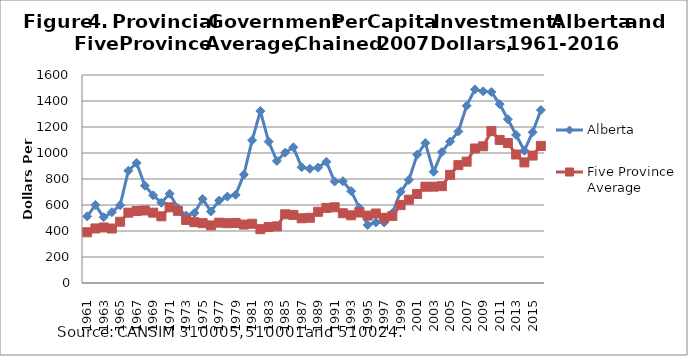
| Category | Alberta | Five Province Average |
|---|---|---|
| 1961.0 | 512.763 | 390.206 |
| 1962.0 | 599.708 | 419.517 |
| 1963.0 | 506.058 | 427.085 |
| 1964.0 | 544.755 | 419.178 |
| 1965.0 | 598.621 | 471.375 |
| 1966.0 | 863.86 | 540.893 |
| 1967.0 | 923.49 | 553.673 |
| 1968.0 | 748.688 | 557.759 |
| 1969.0 | 674.792 | 541.138 |
| 1970.0 | 617.555 | 512.802 |
| 1971.0 | 686.791 | 581.947 |
| 1972.0 | 576.121 | 555.011 |
| 1973.0 | 518.742 | 484.945 |
| 1974.0 | 538.578 | 467.854 |
| 1975.0 | 646.324 | 460.272 |
| 1976.0 | 550.477 | 443.078 |
| 1977.0 | 634.411 | 464.117 |
| 1978.0 | 664.609 | 459.865 |
| 1979.0 | 678.123 | 462.213 |
| 1980.0 | 833.855 | 449.429 |
| 1981.0 | 1098.161 | 455.652 |
| 1982.0 | 1322.459 | 413.983 |
| 1983.0 | 1087.489 | 430.984 |
| 1984.0 | 939.051 | 435.821 |
| 1985.0 | 1002.707 | 528.629 |
| 1986.0 | 1043.598 | 523.491 |
| 1987.0 | 890.663 | 497.951 |
| 1988.0 | 878.445 | 501.846 |
| 1989.0 | 887.795 | 547.729 |
| 1990.0 | 932.181 | 577.638 |
| 1991.0 | 780.772 | 582.277 |
| 1992.0 | 783.235 | 536.443 |
| 1993.0 | 706.709 | 520.745 |
| 1994.0 | 578.389 | 542.18 |
| 1995.0 | 446.148 | 518.517 |
| 1996.0 | 466.284 | 534.718 |
| 1997.0 | 465.749 | 501.801 |
| 1998.0 | 537.414 | 515.962 |
| 1999.0 | 701.733 | 599.403 |
| 2000.0 | 792.225 | 641.033 |
| 2001.0 | 987.219 | 684.76 |
| 2002.0 | 1075.997 | 740.675 |
| 2003.0 | 855.836 | 741.219 |
| 2004.0 | 1006.983 | 745.063 |
| 2005.0 | 1087.716 | 832.053 |
| 2006.0 | 1165.91 | 906.897 |
| 2007.0 | 1363.961 | 933.477 |
| 2008.0 | 1488.978 | 1034.666 |
| 2009.0 | 1474.277 | 1051.458 |
| 2010.0 | 1469.228 | 1167.829 |
| 2011.0 | 1375.92 | 1100.346 |
| 2012.0 | 1259.806 | 1076.445 |
| 2013.0 | 1138.834 | 988.385 |
| 2014.0 | 1017.911 | 927.681 |
| 2015.0 | 1160.016 | 980.375 |
| 2016.0 | 1330.382 | 1054.214 |